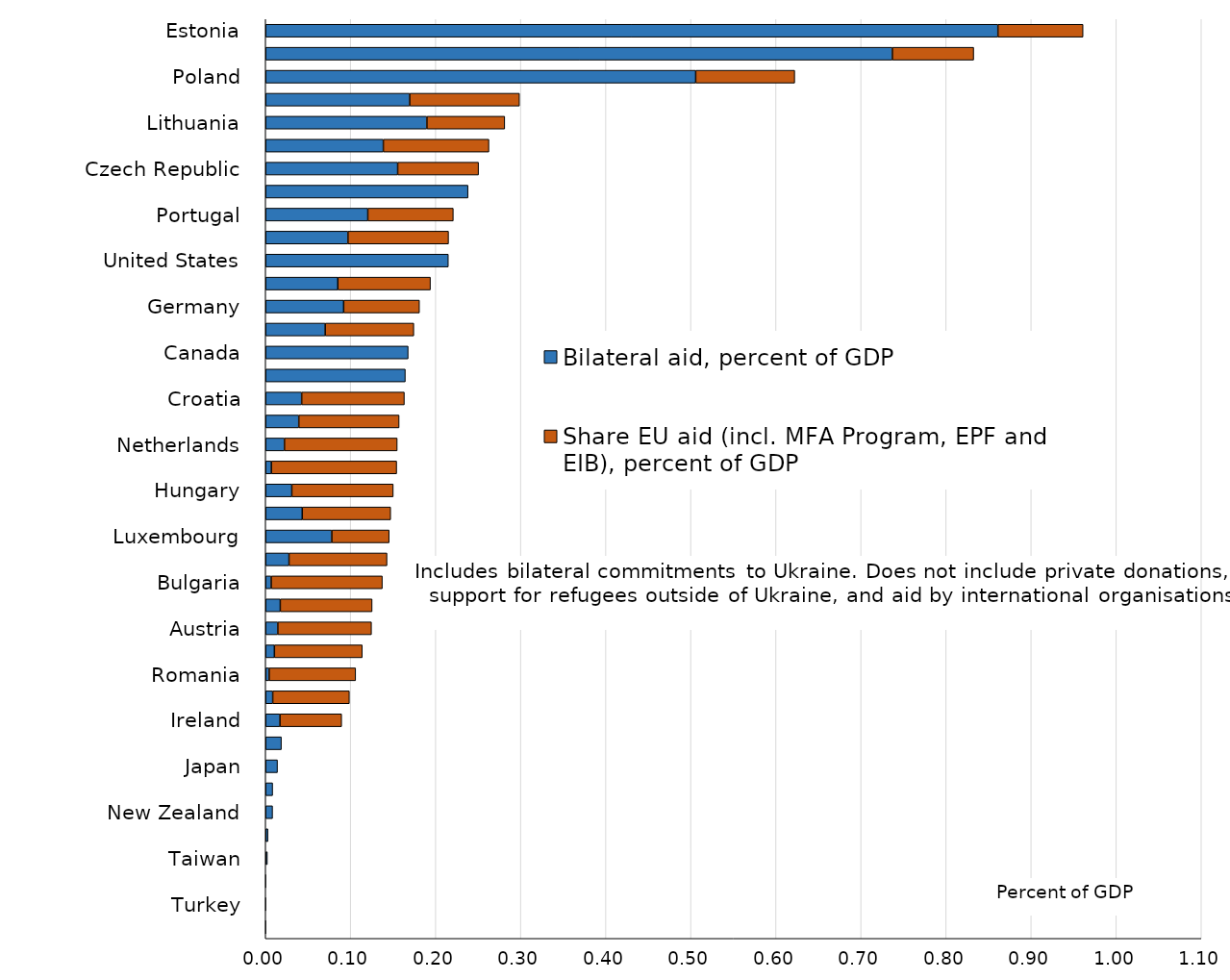
| Category | Bilateral aid, percent of GDP | Share EU aid (incl. MFA Program, EPF and EIB), percent of GDP |
|---|---|---|
| Estonia | 0.861 | 0.1 |
| Latvia | 0.737 | 0.096 |
| Poland | 0.506 | 0.116 |
| Slovakia | 0.169 | 0.129 |
| Lithuania | 0.19 | 0.092 |
| Greece | 0.138 | 0.124 |
| Czech Republic | 0.155 | 0.095 |
| United Kingdom | 0.238 | 0 |
| Portugal | 0.12 | 0.1 |
| Denmark | 0.097 | 0.118 |
| United States | 0.215 | 0 |
| France | 0.085 | 0.109 |
| Germany | 0.092 | 0.089 |
| Sweden | 0.07 | 0.104 |
| Canada | 0.168 | 0 |
| Norway | 0.164 | 0 |
| Croatia | 0.042 | 0.121 |
| Belgium | 0.039 | 0.118 |
| Netherlands | 0.022 | 0.133 |
| Spain | 0.007 | 0.147 |
| Hungary | 0.031 | 0.119 |
| Finland | 0.043 | 0.104 |
| Luxembourg | 0.078 | 0.067 |
| Italy | 0.027 | 0.115 |
| Bulgaria | 0.007 | 0.131 |
| Slovenia | 0.017 | 0.108 |
| Austria | 0.014 | 0.11 |
| Cyprus | 0.01 | 0.103 |
| Romania | 0.004 | 0.102 |
| Malta | 0.008 | 0.09 |
| Ireland | 0.017 | 0.073 |
| Australia | 0.019 | 0 |
| Japan | 0.014 | 0 |
| Switzerland | 0.008 | 0 |
| New Zealand | 0.008 | 0 |
| South Korea | 0.003 | 0 |
| Taiwan | 0.002 | 0 |
| India | 0 | 0 |
| Turkey | 0 | 0 |
| China | 0 | 0 |